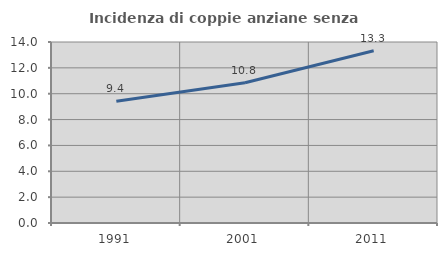
| Category | Incidenza di coppie anziane senza figli  |
|---|---|
| 1991.0 | 9.414 |
| 2001.0 | 10.848 |
| 2011.0 | 13.325 |